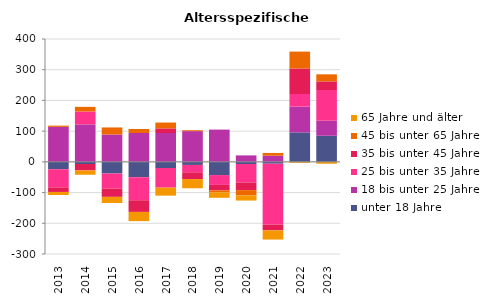
| Category | unter 18 Jahre | 18 bis unter 25 Jahre | 25 bis unter 35 Jahre | 35 bis unter 45 Jahre | 45 bis unter 65 Jahre | 65 Jahre und älter |
|---|---|---|---|---|---|---|
| 2013.0 | -24 | 114 | -59 | -15 | 4 | -10 |
| 2014.0 | -7 | 122 | 42 | -21 | 15 | -14 |
| 2015.0 | -38 | 89 | -49 | -27 | 23 | -20 |
| 2016.0 | -50 | 94 | -75 | -38 | 13 | -30 |
| 2017.0 | -20 | 94 | -64 | 15 | 19 | -26 |
| 2018.0 | -10 | 100 | -24 | -22 | 3 | -30 |
| 2019.0 | -43 | 105 | -32 | -18 | -6 | -18 |
| 2020.0 | -7 | 21 | -60 | -25 | -17 | -17 |
| 2021.0 | -6 | 20 | -198 | -19 | 9 | -30 |
| 2022.0 | 96 | 84 | 41 | 83 | 55 | -3 |
| 2023.0 | 85 | 49 | 100 | 28 | 23 | -6 |